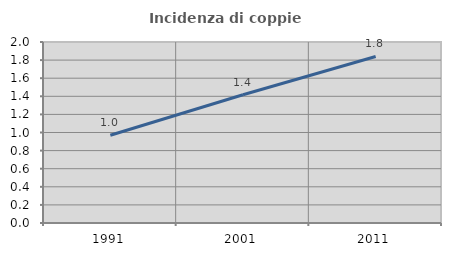
| Category | Incidenza di coppie miste |
|---|---|
| 1991.0 | 0.97 |
| 2001.0 | 1.418 |
| 2011.0 | 1.84 |